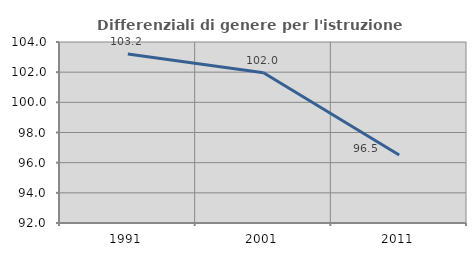
| Category | Differenziali di genere per l'istruzione superiore |
|---|---|
| 1991.0 | 103.209 |
| 2001.0 | 101.963 |
| 2011.0 | 96.506 |